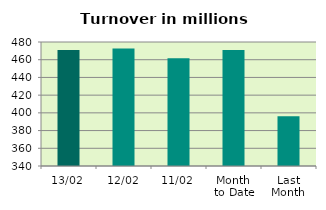
| Category | Series 0 |
|---|---|
| 13/02 | 471.099 |
| 12/02 | 472.633 |
| 11/02 | 461.684 |
| Month 
to Date | 470.98 |
| Last
Month | 396.049 |